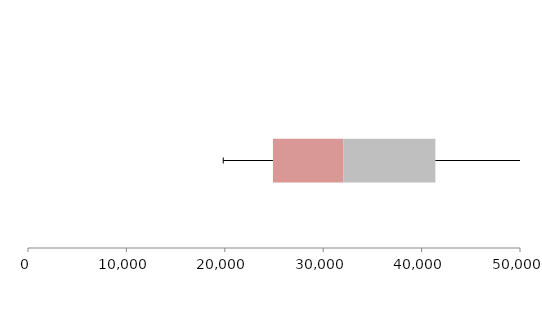
| Category | Series 1 | Series 2 | Series 3 |
|---|---|---|---|
| 0 | 24892.875 | 7145.35 | 9361.805 |